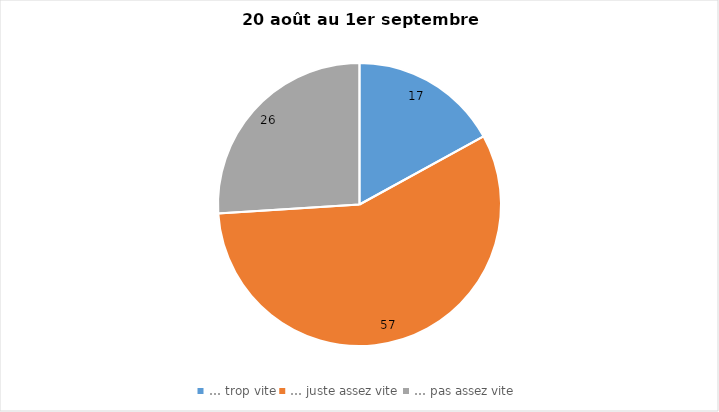
| Category | Series 0 |
|---|---|
| … trop vite | 17 |
| … juste assez vite | 57 |
| … pas assez vite | 26 |